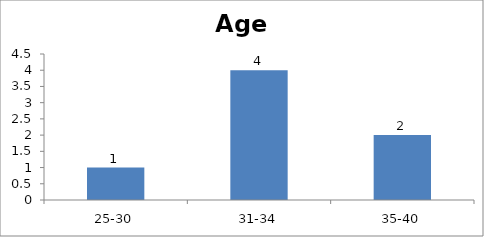
| Category | Age |
|---|---|
| 25-30 | 1 |
| 31-34 | 4 |
| 35-40 | 2 |